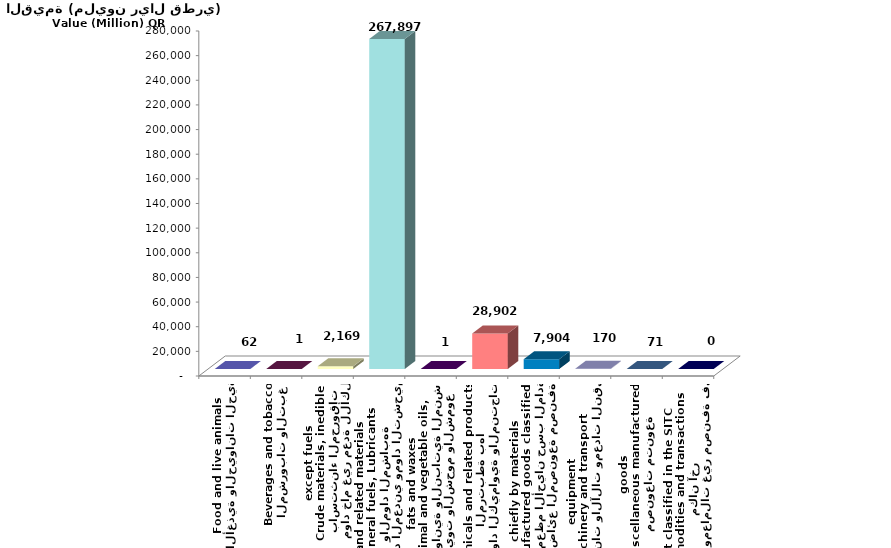
| Category | Series 0 |
|---|---|
| الأغذية والحيوانات الحية
Food and live animals | 62.15 |
| المشروبات والتبغ
Beverages and tobacco | 0.504 |
| مواد خام غير معدة للأكل
باستثناء المحروقات
Crude materials, inedible
except fuels | 2169.007 |
| الوقود المعدني ومواد التشحيم
والمواد المشابهة
Mineral fuels, Lubricants
and related materials | 267896.79 |
| الزيوت والشحوم والشموع
الحيوانية والنباتية المنشأ
Animal and vegetable oils,
fats and waxes | 0.856 |
| المواد الكيماوية والمنتجات المرتبطة بها
Chemicals and related products | 28901.986 |
| البضائع المصنوعة مصنفة
في معظم الأحيان حسب المادة
Manufactured goods classified 
chiefly by materials | 7903.779 |
| الماكينات والآلات ومعدات النقل
Machinery and transport
equipment | 170.036 |
| مصنوعات متنوعة
Miscellaneous manufactured
goods | 70.658 |
| أصناف ومعاملات غير مصنفة في مكان آخر
Commodities and transactions
not classified in the SITC | 0.031 |